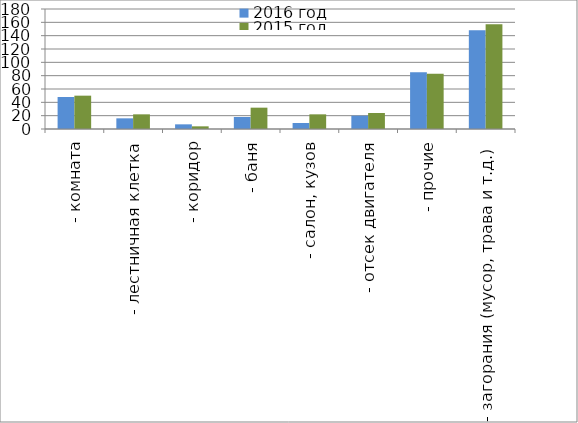
| Category | 2016 год | 2015 год |
|---|---|---|
|  - комната | 48 | 50 |
|  - лестничная клетка | 16 | 22 |
|  - коридор | 7 | 4 |
|  - баня | 18 | 32 |
|  - салон, кузов | 9 | 22 |
|  - отсек двигателя | 20 | 24 |
| - прочие | 85 | 83 |
| - загорания (мусор, трава и т.д.)  | 148 | 157 |